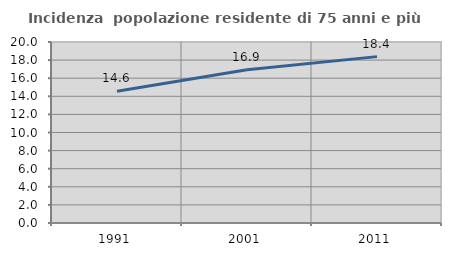
| Category | Incidenza  popolazione residente di 75 anni e più |
|---|---|
| 1991.0 | 14.559 |
| 2001.0 | 16.924 |
| 2011.0 | 18.385 |